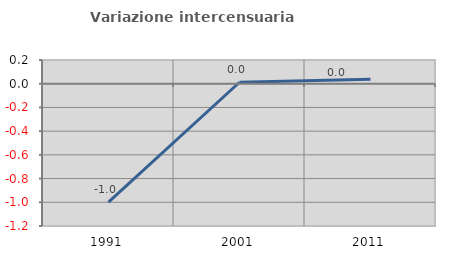
| Category | Variazione intercensuaria annua |
|---|---|
| 1991.0 | -0.998 |
| 2001.0 | 0.012 |
| 2011.0 | 0.037 |